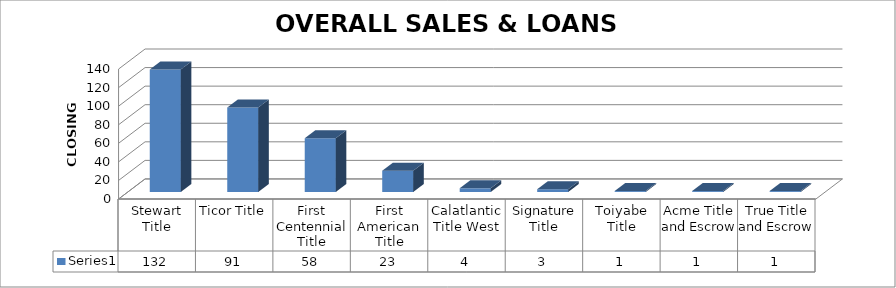
| Category | Series 0 |
|---|---|
| Stewart Title | 132 |
| Ticor Title | 91 |
| First Centennial Title | 58 |
| First American Title | 23 |
| Calatlantic Title West | 4 |
| Signature Title | 3 |
| Toiyabe Title | 1 |
| Acme Title and Escrow | 1 |
| True Title and Escrow | 1 |